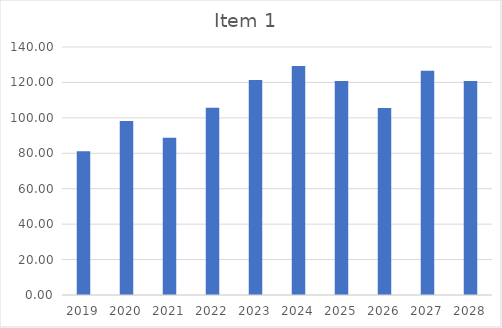
| Category | Item 1 |
|---|---|
| 2019.0 | 81.205 |
| 2020.0 | 98.213 |
| 2021.0 | 88.761 |
| 2022.0 | 105.771 |
| 2023.0 | 121.316 |
| 2024.0 | 129.337 |
| 2025.0 | 120.816 |
| 2026.0 | 105.591 |
| 2027.0 | 126.532 |
| 2028.0 | 120.743 |